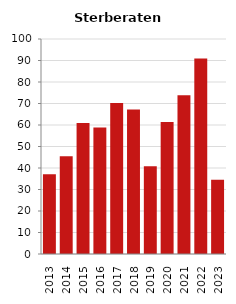
| Category | Sterberate der Bevölkerung ab 80 Jahre (auf Tsd.) |
|---|---|
| 2013.0 | 37.037 |
| 2014.0 | 45.455 |
| 2015.0 | 60.976 |
| 2016.0 | 58.824 |
| 2017.0 | 70.175 |
| 2018.0 | 67.164 |
| 2019.0 | 40.816 |
| 2020.0 | 61.35 |
| 2021.0 | 73.864 |
| 2022.0 | 90.909 |
| 2023.0 | 34.483 |